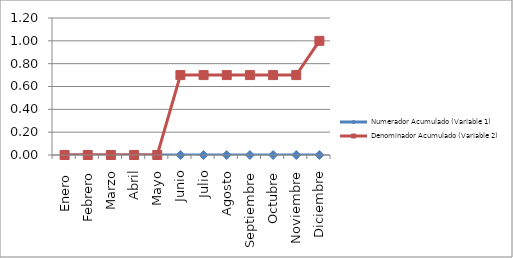
| Category | Numerador Acumulado (Variable 1) | Denominador Acumulado (Variable 2) |
|---|---|---|
| Enero  | 0 | 0 |
| Febrero | 0 | 0 |
| Marzo | 0 | 0 |
| Abril | 0 | 0 |
| Mayo | 0 | 0 |
| Junio | 0 | 0.7 |
| Julio | 0 | 0.7 |
| Agosto | 0 | 0.7 |
| Septiembre | 0 | 0.7 |
| Octubre | 0 | 0.7 |
| Noviembre | 0 | 0.7 |
| Diciembre | 0 | 1 |